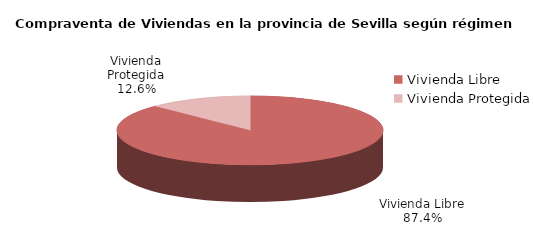
| Category | Series 0 | Series 1 |
|---|---|---|
| Vivienda Libre | 1308 | 0.874 |
| Vivienda Protegida | 188 | 0.126 |